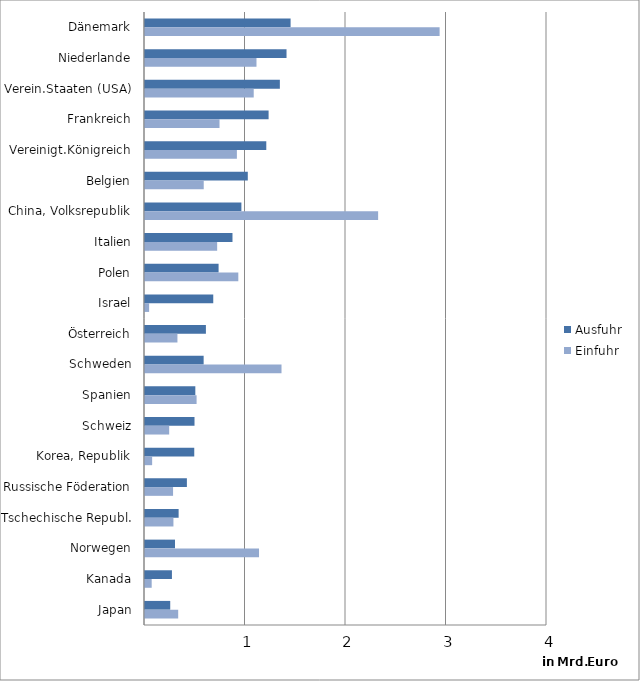
| Category | Ausfuhr | Einfuhr |
|---|---|---|
| Dänemark | 1.449 | 2.931 |
| Niederlande | 1.408 | 1.109 |
| Verein.Staaten (USA) | 1.342 | 1.082 |
| Frankreich | 1.23 | 0.741 |
| Vereinigt.Königreich | 1.207 | 0.914 |
| Belgien | 1.023 | 0.584 |
| China, Volksrepublik | 0.959 | 2.32 |
| Italien | 0.87 | 0.718 |
| Polen | 0.732 | 0.928 |
| Israel | 0.679 | 0.041 |
| Österreich | 0.606 | 0.323 |
| Schweden | 0.584 | 1.358 |
| Spanien | 0.501 | 0.513 |
| Schweiz | 0.493 | 0.241 |
| Korea, Republik | 0.49 | 0.071 |
| Russische Föderation | 0.417 | 0.279 |
| Tschechische Republ. | 0.335 | 0.283 |
| Norwegen | 0.299 | 1.135 |
| Kanada | 0.268 | 0.066 |
| Japan | 0.251 | 0.33 |